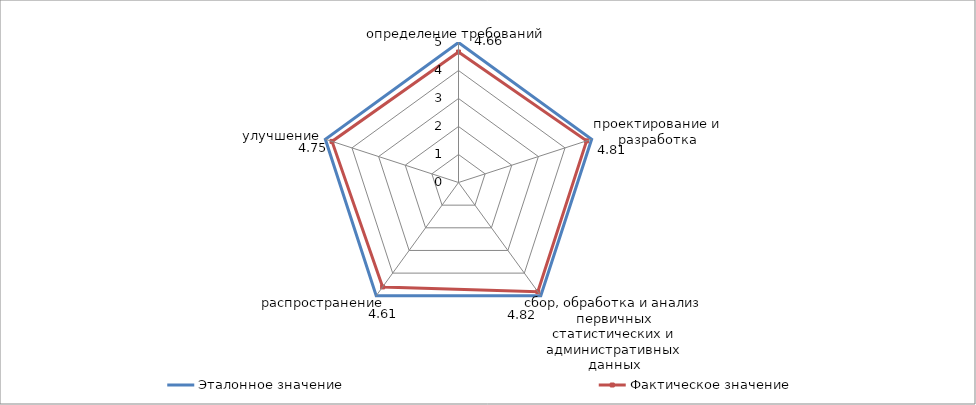
| Category | Эталонное значение | Фактическое значение |
|---|---|---|
| определение требований | 5 | 4.66 |
| проектирование и разработка | 5 | 4.81 |
| сбор, обработка и анализ первичных статистических и административных данных | 5 | 4.82 |
| распространение | 5 | 4.61 |
| улучшение | 5 | 4.75 |